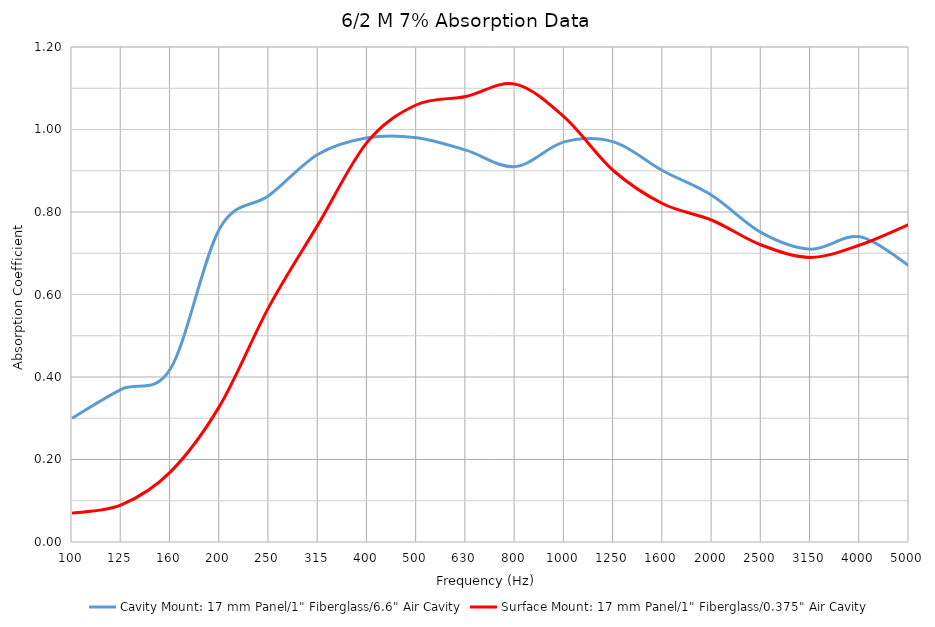
| Category | Cavity Mount: 17 mm Panel/1" Fiberglass/6.6" Air Cavity | Surface Mount: 17 mm Panel/1" Fiberglass/0.375" Air Cavity |
|---|---|---|
| 100.0 | 0.3 | 0.07 |
| 125.0 | 0.37 | 0.09 |
| 160.0 | 0.42 | 0.17 |
| 200.0 | 0.76 | 0.33 |
| 250.0 | 0.84 | 0.57 |
| 315.0 | 0.94 | 0.77 |
| 400.0 | 0.98 | 0.97 |
| 500.0 | 0.98 | 1.06 |
| 630.0 | 0.95 | 1.08 |
| 800.0 | 0.91 | 1.11 |
| 1000.0 | 0.97 | 1.03 |
| 1250.0 | 0.97 | 0.9 |
| 1600.0 | 0.9 | 0.82 |
| 2000.0 | 0.84 | 0.78 |
| 2500.0 | 0.75 | 0.72 |
| 3150.0 | 0.71 | 0.69 |
| 4000.0 | 0.74 | 0.72 |
| 5000.0 | 0.67 | 0.77 |